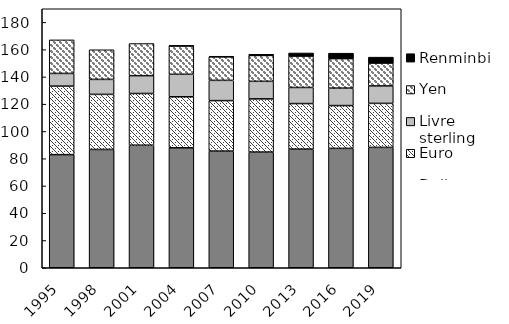
| Category | Dollar | Euro | Livre sterling | Yen | Renminbi |
|---|---|---|---|---|---|
| 1995.0 | 82.995 | 50.254 | 9.306 | 24.619 | 0 |
| 1998.0 | 86.771 | 40.406 | 11.002 | 21.742 | 0 |
| 2001.0 | 89.911 | 37.934 | 13.075 | 23.567 | 0 |
| 2004.0 | 88.004 | 37.435 | 16.494 | 20.838 | 0.103 |
| 2007.0 | 85.59 | 37.034 | 14.862 | 17.238 | 0.451 |
| 2010.0 | 84.848 | 39.039 | 12.887 | 18.978 | 0.856 |
| 2013.0 | 87.026 | 33.414 | 11.816 | 23.054 | 2.24 |
| 2016.0 | 87.584 | 31.386 | 12.811 | 21.634 | 3.987 |
| 2019.0 | 88.309 | 32.282 | 12.798 | 16.801 | 4.321 |